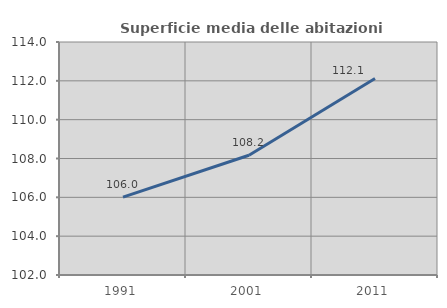
| Category | Superficie media delle abitazioni occupate |
|---|---|
| 1991.0 | 106.01 |
| 2001.0 | 108.168 |
| 2011.0 | 112.117 |